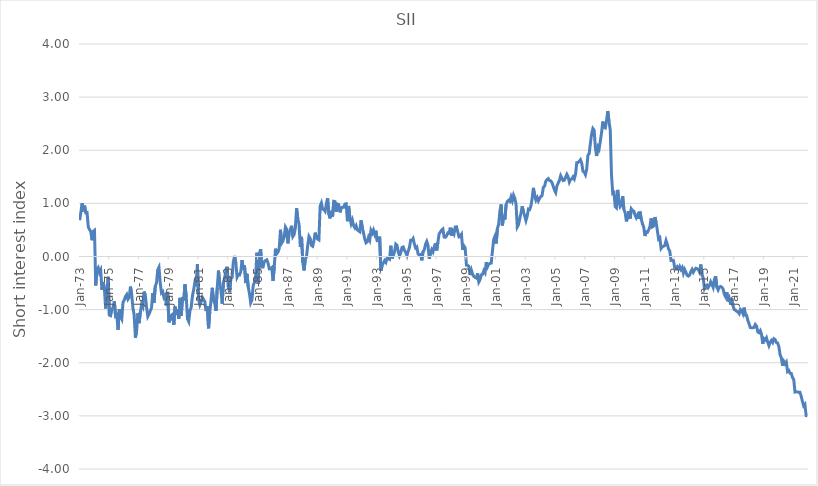
| Category | Series 0 |
|---|---|
| 1973-01-01 | 0.682 |
| 1973-02-01 | 0.832 |
| 1973-03-01 | 1.002 |
| 1973-04-01 | 0.846 |
| 1973-05-01 | 0.957 |
| 1973-06-01 | 0.823 |
| 1973-07-01 | 0.828 |
| 1973-08-01 | 0.554 |
| 1973-09-01 | 0.508 |
| 1973-10-01 | 0.47 |
| 1973-11-01 | 0.306 |
| 1973-12-01 | 0.474 |
| 1974-01-01 | 0.493 |
| 1974-02-01 | -0.545 |
| 1974-03-01 | -0.235 |
| 1974-04-01 | -0.206 |
| 1974-05-01 | -0.301 |
| 1974-06-01 | -0.255 |
| 1974-07-01 | -0.629 |
| 1974-08-01 | -0.479 |
| 1974-09-01 | -0.606 |
| 1974-10-01 | -0.979 |
| 1974-11-01 | -0.698 |
| 1974-12-01 | -0.382 |
| 1975-01-01 | -1.103 |
| 1975-02-01 | -1.114 |
| 1975-03-01 | -1.004 |
| 1975-04-01 | -0.952 |
| 1975-05-01 | -0.845 |
| 1975-06-01 | -1.122 |
| 1975-07-01 | -1.101 |
| 1975-08-01 | -1.379 |
| 1975-09-01 | -0.99 |
| 1975-10-01 | -1.138 |
| 1975-11-01 | -1.181 |
| 1975-12-01 | -0.861 |
| 1976-01-01 | -0.822 |
| 1976-02-01 | -0.753 |
| 1976-03-01 | -0.716 |
| 1976-04-01 | -0.804 |
| 1976-05-01 | -0.769 |
| 1976-06-01 | -0.567 |
| 1976-07-01 | -0.712 |
| 1976-08-01 | -0.972 |
| 1976-09-01 | -1.103 |
| 1976-10-01 | -1.528 |
| 1976-11-01 | -1.398 |
| 1976-12-01 | -1.071 |
| 1977-01-01 | -1.254 |
| 1977-02-01 | -1.048 |
| 1977-03-01 | -0.905 |
| 1977-04-01 | -0.95 |
| 1977-05-01 | -0.66 |
| 1977-06-01 | -0.729 |
| 1977-07-01 | -0.956 |
| 1977-08-01 | -1.129 |
| 1977-09-01 | -1.087 |
| 1977-10-01 | -1.024 |
| 1977-11-01 | -0.967 |
| 1977-12-01 | -0.691 |
| 1978-01-01 | -0.874 |
| 1978-02-01 | -0.563 |
| 1978-03-01 | -0.5 |
| 1978-04-01 | -0.252 |
| 1978-05-01 | -0.203 |
| 1978-06-01 | -0.491 |
| 1978-07-01 | -0.682 |
| 1978-08-01 | -0.659 |
| 1978-09-01 | -0.769 |
| 1978-10-01 | -0.733 |
| 1978-11-01 | -0.922 |
| 1978-12-01 | -0.666 |
| 1979-01-01 | -1.239 |
| 1979-02-01 | -1.188 |
| 1979-03-01 | -1.107 |
| 1979-04-01 | -1.088 |
| 1979-05-01 | -1.285 |
| 1979-06-01 | -0.943 |
| 1979-07-01 | -1.102 |
| 1979-08-01 | -0.996 |
| 1979-09-01 | -1.169 |
| 1979-10-01 | -0.779 |
| 1979-11-01 | -1.113 |
| 1979-12-01 | -0.768 |
| 1980-01-01 | -0.829 |
| 1980-02-01 | -0.524 |
| 1980-03-01 | -0.759 |
| 1980-04-01 | -1.173 |
| 1980-05-01 | -1.225 |
| 1980-06-01 | -1.021 |
| 1980-07-01 | -0.957 |
| 1980-08-01 | -0.743 |
| 1980-09-01 | -0.624 |
| 1980-10-01 | -0.478 |
| 1980-11-01 | -0.513 |
| 1980-12-01 | -0.146 |
| 1981-01-01 | -0.814 |
| 1981-02-01 | -0.911 |
| 1981-03-01 | -0.853 |
| 1981-04-01 | -0.768 |
| 1981-05-01 | -0.81 |
| 1981-06-01 | -0.848 |
| 1981-07-01 | -1.028 |
| 1981-08-01 | -0.937 |
| 1981-09-01 | -1.352 |
| 1981-10-01 | -1.033 |
| 1981-11-01 | -0.825 |
| 1981-12-01 | -0.589 |
| 1982-01-01 | -0.832 |
| 1982-02-01 | -0.885 |
| 1982-03-01 | -1.023 |
| 1982-04-01 | -0.59 |
| 1982-05-01 | -0.266 |
| 1982-06-01 | -0.504 |
| 1982-07-01 | -0.638 |
| 1982-08-01 | -0.889 |
| 1982-09-01 | -0.489 |
| 1982-10-01 | -0.402 |
| 1982-11-01 | -0.259 |
| 1982-12-01 | -0.194 |
| 1983-01-01 | -0.578 |
| 1983-02-01 | -0.675 |
| 1983-03-01 | -0.398 |
| 1983-04-01 | -0.393 |
| 1983-05-01 | -0.101 |
| 1983-06-01 | 0.012 |
| 1983-07-01 | -0.124 |
| 1983-08-01 | -0.388 |
| 1983-09-01 | -0.338 |
| 1983-10-01 | -0.347 |
| 1983-11-01 | -0.285 |
| 1983-12-01 | -0.068 |
| 1984-01-01 | -0.248 |
| 1984-02-01 | -0.171 |
| 1984-03-01 | -0.5 |
| 1984-04-01 | -0.325 |
| 1984-05-01 | -0.573 |
| 1984-06-01 | -0.698 |
| 1984-07-01 | -0.871 |
| 1984-08-01 | -0.815 |
| 1984-09-01 | -0.548 |
| 1984-10-01 | -0.486 |
| 1984-11-01 | -0.371 |
| 1984-12-01 | 0.071 |
| 1985-01-01 | -0.517 |
| 1985-02-01 | 0.054 |
| 1985-03-01 | 0.136 |
| 1985-04-01 | -0.196 |
| 1985-05-01 | -0.196 |
| 1985-06-01 | -0.098 |
| 1985-07-01 | -0.075 |
| 1985-08-01 | -0.063 |
| 1985-09-01 | -0.125 |
| 1985-10-01 | -0.232 |
| 1985-11-01 | -0.23 |
| 1985-12-01 | -0.209 |
| 1986-01-01 | -0.459 |
| 1986-02-01 | -0.191 |
| 1986-03-01 | 0.147 |
| 1986-04-01 | 0.053 |
| 1986-05-01 | 0.083 |
| 1986-06-01 | 0.15 |
| 1986-07-01 | 0.503 |
| 1986-08-01 | 0.253 |
| 1986-09-01 | 0.291 |
| 1986-10-01 | 0.371 |
| 1986-11-01 | 0.555 |
| 1986-12-01 | 0.513 |
| 1987-01-01 | 0.247 |
| 1987-02-01 | 0.447 |
| 1987-03-01 | 0.513 |
| 1987-04-01 | 0.578 |
| 1987-05-01 | 0.376 |
| 1987-06-01 | 0.412 |
| 1987-07-01 | 0.533 |
| 1987-08-01 | 0.908 |
| 1987-09-01 | 0.708 |
| 1987-10-01 | 0.602 |
| 1987-11-01 | 0.185 |
| 1987-12-01 | 0.37 |
| 1988-01-01 | -0.107 |
| 1988-02-01 | -0.262 |
| 1988-03-01 | -0.057 |
| 1988-04-01 | 0.001 |
| 1988-05-01 | 0.211 |
| 1988-06-01 | 0.378 |
| 1988-07-01 | 0.339 |
| 1988-08-01 | 0.209 |
| 1988-09-01 | 0.193 |
| 1988-10-01 | 0.293 |
| 1988-11-01 | 0.449 |
| 1988-12-01 | 0.358 |
| 1989-01-01 | 0.328 |
| 1989-02-01 | 0.313 |
| 1989-03-01 | 0.948 |
| 1989-04-01 | 1.006 |
| 1989-05-01 | 0.893 |
| 1989-06-01 | 0.885 |
| 1989-07-01 | 0.852 |
| 1989-08-01 | 0.987 |
| 1989-09-01 | 1.099 |
| 1989-10-01 | 0.795 |
| 1989-11-01 | 0.718 |
| 1989-12-01 | 0.859 |
| 1990-01-01 | 0.748 |
| 1990-02-01 | 1.039 |
| 1990-03-01 | 1.033 |
| 1990-04-01 | 0.844 |
| 1990-05-01 | 0.988 |
| 1990-06-01 | 0.978 |
| 1990-07-01 | 0.831 |
| 1990-08-01 | 0.918 |
| 1990-09-01 | 0.928 |
| 1990-10-01 | 0.928 |
| 1990-11-01 | 0.987 |
| 1990-12-01 | 0.993 |
| 1991-01-01 | 0.664 |
| 1991-02-01 | 0.952 |
| 1991-03-01 | 0.728 |
| 1991-04-01 | 0.618 |
| 1991-05-01 | 0.685 |
| 1991-06-01 | 0.58 |
| 1991-07-01 | 0.539 |
| 1991-08-01 | 0.581 |
| 1991-09-01 | 0.503 |
| 1991-10-01 | 0.484 |
| 1991-11-01 | 0.467 |
| 1991-12-01 | 0.68 |
| 1992-01-01 | 0.546 |
| 1992-02-01 | 0.442 |
| 1992-03-01 | 0.33 |
| 1992-04-01 | 0.259 |
| 1992-05-01 | 0.277 |
| 1992-06-01 | 0.362 |
| 1992-07-01 | 0.31 |
| 1992-08-01 | 0.489 |
| 1992-09-01 | 0.439 |
| 1992-10-01 | 0.498 |
| 1992-11-01 | 0.42 |
| 1992-12-01 | 0.486 |
| 1993-01-01 | 0.301 |
| 1993-02-01 | 0.31 |
| 1993-03-01 | 0.374 |
| 1993-04-01 | -0.267 |
| 1993-05-01 | -0.167 |
| 1993-06-01 | -0.123 |
| 1993-07-01 | -0.076 |
| 1993-08-01 | -0.11 |
| 1993-09-01 | -0.031 |
| 1993-10-01 | -0.042 |
| 1993-11-01 | -0.053 |
| 1993-12-01 | 0.203 |
| 1994-01-01 | -0.037 |
| 1994-02-01 | 0.02 |
| 1994-03-01 | 0.087 |
| 1994-04-01 | 0.232 |
| 1994-05-01 | 0.21 |
| 1994-06-01 | 0.09 |
| 1994-07-01 | 0.013 |
| 1994-08-01 | 0.07 |
| 1994-09-01 | 0.169 |
| 1994-10-01 | 0.179 |
| 1994-11-01 | 0.116 |
| 1994-12-01 | 0.081 |
| 1995-01-01 | 0.016 |
| 1995-02-01 | 0.1 |
| 1995-03-01 | 0.165 |
| 1995-04-01 | 0.304 |
| 1995-05-01 | 0.3 |
| 1995-06-01 | 0.337 |
| 1995-07-01 | 0.236 |
| 1995-08-01 | 0.161 |
| 1995-09-01 | 0.179 |
| 1995-10-01 | 0.046 |
| 1995-11-01 | 0.028 |
| 1995-12-01 | 0.037 |
| 1996-01-01 | -0.072 |
| 1996-02-01 | 0.091 |
| 1996-03-01 | 0.124 |
| 1996-04-01 | 0.23 |
| 1996-05-01 | 0.283 |
| 1996-06-01 | 0.211 |
| 1996-07-01 | -0.041 |
| 1996-08-01 | 0.062 |
| 1996-09-01 | 0.13 |
| 1996-10-01 | 0.087 |
| 1996-11-01 | 0.179 |
| 1996-12-01 | 0.247 |
| 1997-01-01 | 0.114 |
| 1997-02-01 | 0.271 |
| 1997-03-01 | 0.429 |
| 1997-04-01 | 0.461 |
| 1997-05-01 | 0.496 |
| 1997-06-01 | 0.518 |
| 1997-07-01 | 0.367 |
| 1997-08-01 | 0.361 |
| 1997-09-01 | 0.389 |
| 1997-10-01 | 0.445 |
| 1997-11-01 | 0.437 |
| 1997-12-01 | 0.543 |
| 1998-01-01 | 0.394 |
| 1998-02-01 | 0.475 |
| 1998-03-01 | 0.427 |
| 1998-04-01 | 0.557 |
| 1998-05-01 | 0.558 |
| 1998-06-01 | 0.464 |
| 1998-07-01 | 0.37 |
| 1998-08-01 | 0.382 |
| 1998-09-01 | 0.416 |
| 1998-10-01 | 0.124 |
| 1998-11-01 | 0.198 |
| 1998-12-01 | 0.159 |
| 1999-01-01 | -0.162 |
| 1999-02-01 | -0.166 |
| 1999-03-01 | -0.186 |
| 1999-04-01 | -0.349 |
| 1999-05-01 | -0.258 |
| 1999-06-01 | -0.336 |
| 1999-07-01 | -0.374 |
| 1999-08-01 | -0.392 |
| 1999-09-01 | -0.405 |
| 1999-10-01 | -0.316 |
| 1999-11-01 | -0.479 |
| 1999-12-01 | -0.435 |
| 2000-01-01 | -0.347 |
| 2000-02-01 | -0.335 |
| 2000-03-01 | -0.268 |
| 2000-04-01 | -0.306 |
| 2000-05-01 | -0.107 |
| 2000-06-01 | -0.193 |
| 2000-07-01 | -0.143 |
| 2000-08-01 | -0.13 |
| 2000-09-01 | -0.124 |
| 2000-10-01 | 0.109 |
| 2000-11-01 | 0.322 |
| 2000-12-01 | 0.381 |
| 2001-01-01 | 0.245 |
| 2001-02-01 | 0.529 |
| 2001-03-01 | 0.606 |
| 2001-04-01 | 0.855 |
| 2001-05-01 | 0.979 |
| 2001-06-01 | 0.584 |
| 2001-07-01 | 0.772 |
| 2001-08-01 | 0.696 |
| 2001-09-01 | 0.972 |
| 2001-10-01 | 1.037 |
| 2001-11-01 | 1.058 |
| 2001-12-01 | 1.038 |
| 2002-01-01 | 1.122 |
| 2002-02-01 | 1.05 |
| 2002-03-01 | 1.154 |
| 2002-04-01 | 1.096 |
| 2002-05-01 | 0.99 |
| 2002-06-01 | 0.555 |
| 2002-07-01 | 0.599 |
| 2002-08-01 | 0.712 |
| 2002-09-01 | 0.814 |
| 2002-10-01 | 0.946 |
| 2002-11-01 | 0.84 |
| 2002-12-01 | 0.765 |
| 2003-01-01 | 0.677 |
| 2003-02-01 | 0.76 |
| 2003-03-01 | 0.893 |
| 2003-04-01 | 0.885 |
| 2003-05-01 | 0.95 |
| 2003-06-01 | 1.09 |
| 2003-07-01 | 1.292 |
| 2003-08-01 | 1.142 |
| 2003-09-01 | 1.063 |
| 2003-10-01 | 1.112 |
| 2003-11-01 | 1.046 |
| 2003-12-01 | 1.093 |
| 2004-01-01 | 1.131 |
| 2004-02-01 | 1.147 |
| 2004-03-01 | 1.299 |
| 2004-04-01 | 1.321 |
| 2004-05-01 | 1.416 |
| 2004-06-01 | 1.448 |
| 2004-07-01 | 1.467 |
| 2004-08-01 | 1.431 |
| 2004-09-01 | 1.424 |
| 2004-10-01 | 1.392 |
| 2004-11-01 | 1.319 |
| 2004-12-01 | 1.251 |
| 2005-01-01 | 1.205 |
| 2005-02-01 | 1.331 |
| 2005-03-01 | 1.381 |
| 2005-04-01 | 1.431 |
| 2005-05-01 | 1.521 |
| 2005-06-01 | 1.473 |
| 2005-07-01 | 1.429 |
| 2005-08-01 | 1.437 |
| 2005-09-01 | 1.493 |
| 2005-10-01 | 1.547 |
| 2005-11-01 | 1.498 |
| 2005-12-01 | 1.4 |
| 2006-01-01 | 1.449 |
| 2006-02-01 | 1.461 |
| 2006-03-01 | 1.5 |
| 2006-04-01 | 1.46 |
| 2006-05-01 | 1.549 |
| 2006-06-01 | 1.767 |
| 2006-07-01 | 1.768 |
| 2006-08-01 | 1.791 |
| 2006-09-01 | 1.82 |
| 2006-10-01 | 1.755 |
| 2006-11-01 | 1.604 |
| 2006-12-01 | 1.589 |
| 2007-01-01 | 1.54 |
| 2007-02-01 | 1.646 |
| 2007-03-01 | 1.906 |
| 2007-04-01 | 1.938 |
| 2007-05-01 | 2.133 |
| 2007-06-01 | 2.31 |
| 2007-07-01 | 2.409 |
| 2007-08-01 | 2.377 |
| 2007-09-01 | 2.048 |
| 2007-10-01 | 1.892 |
| 2007-11-01 | 2.064 |
| 2007-12-01 | 2.022 |
| 2008-01-01 | 2.174 |
| 2008-02-01 | 2.331 |
| 2008-03-01 | 2.54 |
| 2008-04-01 | 2.432 |
| 2008-05-01 | 2.42 |
| 2008-06-01 | 2.552 |
| 2008-07-01 | 2.738 |
| 2008-08-01 | 2.536 |
| 2008-09-01 | 2.386 |
| 2008-10-01 | 1.538 |
| 2008-11-01 | 1.188 |
| 2008-12-01 | 1.202 |
| 2009-01-01 | 0.94 |
| 2009-02-01 | 0.916 |
| 2009-03-01 | 1.254 |
| 2009-04-01 | 1.04 |
| 2009-05-01 | 0.939 |
| 2009-06-01 | 0.974 |
| 2009-07-01 | 1.136 |
| 2009-08-01 | 0.885 |
| 2009-09-01 | 0.826 |
| 2009-10-01 | 0.661 |
| 2009-11-01 | 0.743 |
| 2009-12-01 | 0.854 |
| 2010-01-01 | 0.714 |
| 2010-02-01 | 0.896 |
| 2010-03-01 | 0.864 |
| 2010-04-01 | 0.854 |
| 2010-05-01 | 0.781 |
| 2010-06-01 | 0.73 |
| 2010-07-01 | 0.779 |
| 2010-08-01 | 0.713 |
| 2010-09-01 | 0.845 |
| 2010-10-01 | 0.704 |
| 2010-11-01 | 0.614 |
| 2010-12-01 | 0.553 |
| 2011-01-01 | 0.386 |
| 2011-02-01 | 0.465 |
| 2011-03-01 | 0.457 |
| 2011-04-01 | 0.501 |
| 2011-05-01 | 0.563 |
| 2011-06-01 | 0.716 |
| 2011-07-01 | 0.558 |
| 2011-08-01 | 0.575 |
| 2011-09-01 | 0.742 |
| 2011-10-01 | 0.642 |
| 2011-11-01 | 0.488 |
| 2011-12-01 | 0.327 |
| 2012-01-01 | 0.35 |
| 2012-02-01 | 0.151 |
| 2012-03-01 | 0.183 |
| 2012-04-01 | 0.193 |
| 2012-05-01 | 0.207 |
| 2012-06-01 | 0.301 |
| 2012-07-01 | 0.232 |
| 2012-08-01 | 0.144 |
| 2012-09-01 | 0.101 |
| 2012-10-01 | -0.073 |
| 2012-11-01 | -0.069 |
| 2012-12-01 | -0.075 |
| 2013-01-01 | -0.213 |
| 2013-02-01 | -0.232 |
| 2013-03-01 | -0.195 |
| 2013-04-01 | -0.237 |
| 2013-05-01 | -0.188 |
| 2013-06-01 | -0.242 |
| 2013-07-01 | -0.206 |
| 2013-08-01 | -0.314 |
| 2013-09-01 | -0.244 |
| 2013-10-01 | -0.293 |
| 2013-11-01 | -0.354 |
| 2013-12-01 | -0.369 |
| 2014-01-01 | -0.351 |
| 2014-02-01 | -0.284 |
| 2014-03-01 | -0.242 |
| 2014-04-01 | -0.296 |
| 2014-05-01 | -0.254 |
| 2014-06-01 | -0.222 |
| 2014-07-01 | -0.23 |
| 2014-08-01 | -0.245 |
| 2014-09-01 | -0.293 |
| 2014-10-01 | -0.151 |
| 2014-11-01 | -0.33 |
| 2014-12-01 | -0.412 |
| 2015-01-01 | -0.605 |
| 2015-02-01 | -0.561 |
| 2015-03-01 | -0.541 |
| 2015-04-01 | -0.583 |
| 2015-05-01 | -0.545 |
| 2015-06-01 | -0.475 |
| 2015-07-01 | -0.521 |
| 2015-08-01 | -0.58 |
| 2015-09-01 | -0.43 |
| 2015-10-01 | -0.373 |
| 2015-11-01 | -0.582 |
| 2015-12-01 | -0.63 |
| 2016-01-01 | -0.575 |
| 2016-02-01 | -0.564 |
| 2016-03-01 | -0.579 |
| 2016-04-01 | -0.61 |
| 2016-05-01 | -0.713 |
| 2016-06-01 | -0.757 |
| 2016-07-01 | -0.671 |
| 2016-08-01 | -0.844 |
| 2016-09-01 | -0.786 |
| 2016-10-01 | -0.887 |
| 2016-11-01 | -0.789 |
| 2016-12-01 | -0.924 |
| 2017-01-01 | -1 |
| 2017-02-01 | -1.011 |
| 2017-03-01 | -1.032 |
| 2017-04-01 | -1.042 |
| 2017-05-01 | -1.076 |
| 2017-06-01 | -0.995 |
| 2017-07-01 | -1.017 |
| 2017-08-01 | -1.075 |
| 2017-09-01 | -0.962 |
| 2017-10-01 | -1.106 |
| 2017-11-01 | -1.111 |
| 2017-12-01 | -1.205 |
| 2018-01-01 | -1.268 |
| 2018-02-01 | -1.338 |
| 2018-03-01 | -1.34 |
| 2018-04-01 | -1.341 |
| 2018-05-01 | -1.334 |
| 2018-06-01 | -1.28 |
| 2018-07-01 | -1.308 |
| 2018-08-01 | -1.42 |
| 2018-09-01 | -1.435 |
| 2018-10-01 | -1.396 |
| 2018-11-01 | -1.462 |
| 2018-12-01 | -1.643 |
| 2019-01-01 | -1.547 |
| 2019-02-01 | -1.569 |
| 2019-03-01 | -1.53 |
| 2019-04-01 | -1.614 |
| 2019-05-01 | -1.679 |
| 2019-06-01 | -1.613 |
| 2019-07-01 | -1.58 |
| 2019-08-01 | -1.617 |
| 2019-09-01 | -1.548 |
| 2019-10-01 | -1.563 |
| 2019-11-01 | -1.619 |
| 2019-12-01 | -1.628 |
| 2020-01-01 | -1.695 |
| 2020-02-01 | -1.85 |
| 2020-03-01 | -1.91 |
| 2020-04-01 | -2.055 |
| 2020-05-01 | -1.976 |
| 2020-06-01 | -2.019 |
| 2020-07-01 | -1.986 |
| 2020-08-01 | -2.163 |
| 2020-09-01 | -2.144 |
| 2020-10-01 | -2.197 |
| 2020-11-01 | -2.201 |
| 2020-12-01 | -2.279 |
| 2021-01-01 | -2.315 |
| 2021-02-01 | -2.552 |
| 2021-03-01 | -2.547 |
| 2021-04-01 | -2.549 |
| 2021-05-01 | -2.558 |
| 2021-06-01 | -2.556 |
| 2021-07-01 | -2.629 |
| 2021-08-01 | -2.727 |
| 2021-09-01 | -2.81 |
| 2021-10-01 | -2.783 |
| 2021-11-01 | -2.995 |
| 2021-12-01 | -3 |